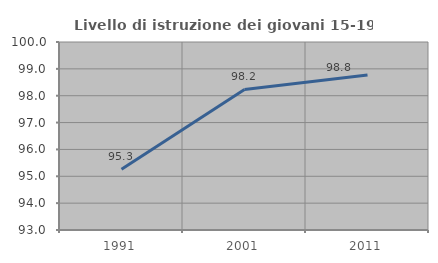
| Category | Livello di istruzione dei giovani 15-19 anni |
|---|---|
| 1991.0 | 95.264 |
| 2001.0 | 98.235 |
| 2011.0 | 98.775 |